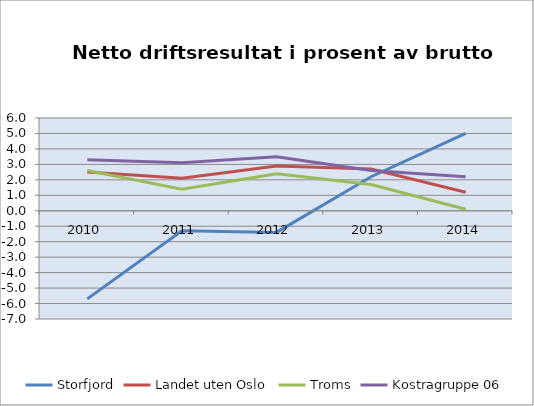
| Category | Storfjord | Landet uten Oslo | Troms | Kostragruppe 06 |
|---|---|---|---|---|
| 2010 | -5.7 | 2.5 | 2.6 | 3.3 |
| 2011 | -1.3 | 2.1 | 1.4 | 3.1 |
| 2012 | -1.4 | 2.9 | 2.4 | 3.5 |
| 2013 | 2.2 | 2.7 | 1.7 | 2.6 |
| 2014 | 5 | 1.2 | 0.1 | 2.2 |